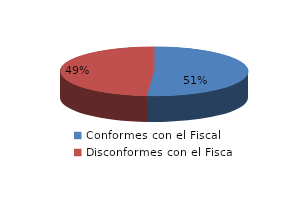
| Category | Series 0 |
|---|---|
| 0 | 22 |
| 1 | 21 |